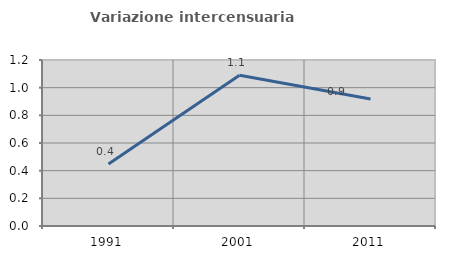
| Category | Variazione intercensuaria annua |
|---|---|
| 1991.0 | 0.448 |
| 2001.0 | 1.089 |
| 2011.0 | 0.918 |